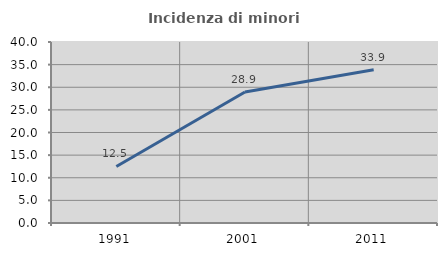
| Category | Incidenza di minori stranieri |
|---|---|
| 1991.0 | 12.5 |
| 2001.0 | 28.947 |
| 2011.0 | 33.884 |